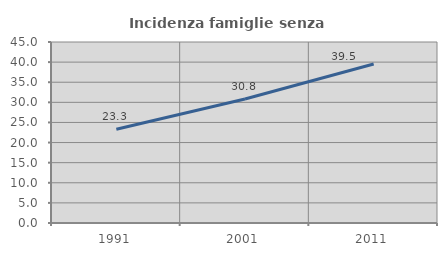
| Category | Incidenza famiglie senza nuclei |
|---|---|
| 1991.0 | 23.329 |
| 2001.0 | 30.832 |
| 2011.0 | 39.548 |